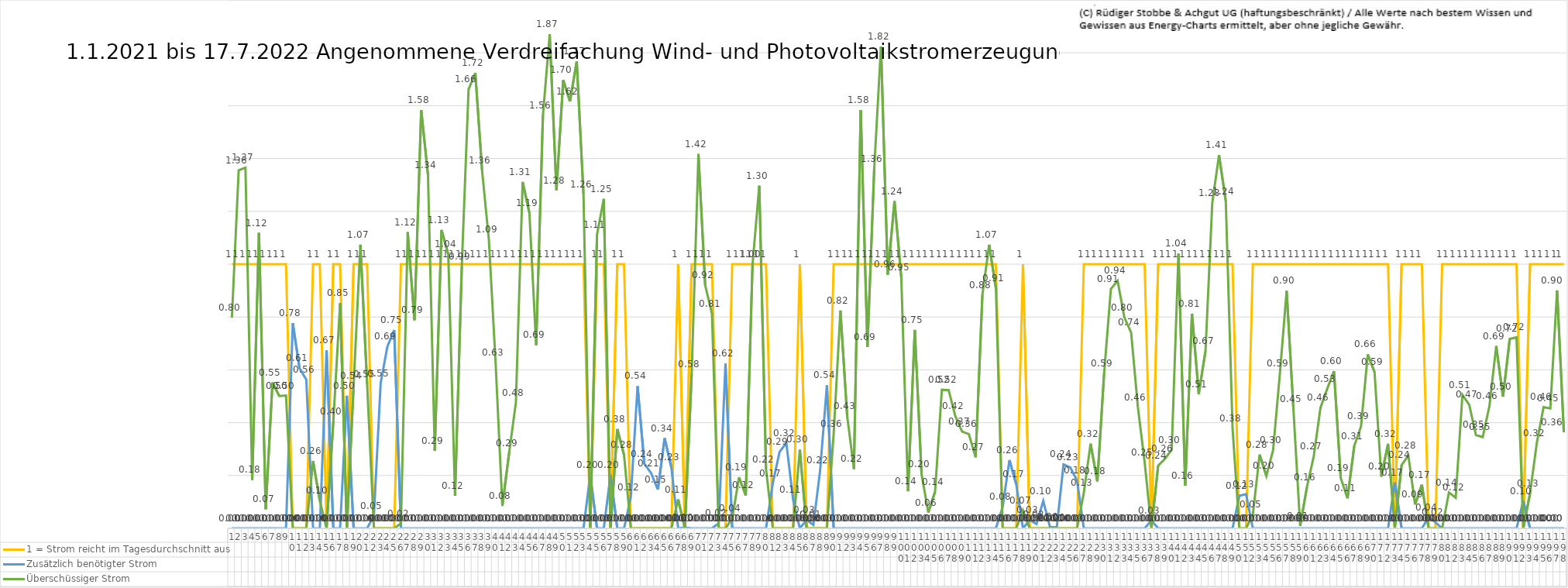
| Category | 1 = Strom reicht im Tagesdurchschnitt aus | Zusätzlich benötigter Strom | Überschüssiger Strom |
|---|---|---|---|
| 0 | 1 | 0 | 0.798 |
| 1 | 1 | 0 | 1.356 |
| 2 | 1 | 0 | 1.366 |
| 3 | 1 | 0 | 0.184 |
| 4 | 1 | 0 | 1.118 |
| 5 | 1 | 0 | 0.073 |
| 6 | 1 | 0 | 0.553 |
| 7 | 1 | 0 | 0.501 |
| 8 | 1 | 0 | 0.503 |
| 9 | 0 | 0.777 | 0 |
| 10 | 0 | 0.606 | 0 |
| 11 | 0 | 0.563 | 0 |
| 12 | 1 | 0 | 0.255 |
| 13 | 1 | 0 | 0.104 |
| 14 | 0 | 0.673 | 0 |
| 15 | 1 | 0 | 0.405 |
| 16 | 1 | 0 | 0.852 |
| 17 | 0 | 0.502 | 0 |
| 18 | 1 | 0 | 0.54 |
| 19 | 1 | 0 | 1.074 |
| 20 | 1 | 0 | 0.546 |
| 21 | 0 | 0.048 | 0 |
| 22 | 0 | 0.55 | 0 |
| 23 | 0 | 0.688 | 0 |
| 24 | 0 | 0.751 | 0 |
| 25 | 1 | 0 | 0.018 |
| 26 | 1 | 0 | 1.121 |
| 27 | 1 | 0 | 0.788 |
| 28 | 1 | 0 | 1.583 |
| 29 | 1 | 0 | 1.338 |
| 30 | 1 | 0 | 0.293 |
| 31 | 1 | 0 | 1.13 |
| 32 | 1 | 0 | 1.037 |
| 33 | 1 | 0 | 0.123 |
| 34 | 1 | 0 | 0.992 |
| 35 | 1 | 0 | 1.662 |
| 36 | 1 | 0 | 1.724 |
| 37 | 1 | 0 | 1.355 |
| 38 | 1 | 0 | 1.094 |
| 39 | 1 | 0 | 0.628 |
| 40 | 1 | 0 | 0.085 |
| 41 | 1 | 0 | 0.286 |
| 42 | 1 | 0 | 0.476 |
| 43 | 1 | 0 | 1.311 |
| 44 | 1 | 0 | 1.194 |
| 45 | 1 | 0 | 0.694 |
| 46 | 1 | 0 | 1.563 |
| 47 | 1 | 0 | 1.87 |
| 48 | 1 | 0 | 1.28 |
| 49 | 1 | 0 | 1.697 |
| 50 | 1 | 0 | 1.616 |
| 51 | 1 | 0 | 1.767 |
| 52 | 1 | 0 | 1.264 |
| 53 | 0 | 0.202 | 0 |
| 54 | 1 | 0 | 1.112 |
| 55 | 1 | 0 | 1.247 |
| 56 | 0 | 0.202 | 0 |
| 57 | 1 | 0 | 0.376 |
| 58 | 1 | 0 | 0.278 |
| 59 | 0 | 0.118 | 0 |
| 60 | 0 | 0.538 | 0 |
| 61 | 0 | 0.244 | 0 |
| 62 | 0 | 0.209 | 0 |
| 63 | 0 | 0.147 | 0 |
| 64 | 0 | 0.341 | 0 |
| 65 | 0 | 0.231 | 0 |
| 66 | 1 | 0 | 0.11 |
| 67 | 0 | 0.003 | 0 |
| 68 | 1 | 0 | 0.584 |
| 69 | 1 | 0 | 1.417 |
| 70 | 1 | 0 | 0.92 |
| 71 | 1 | 0 | 0.813 |
| 72 | 0 | 0.019 | 0 |
| 73 | 0 | 0.624 | 0 |
| 74 | 1 | 0 | 0.038 |
| 75 | 1 | 0 | 0.193 |
| 76 | 1 | 0 | 0.125 |
| 77 | 1 | 0 | 0.999 |
| 78 | 1 | 0 | 1.297 |
| 79 | 1 | 0 | 0.224 |
| 80 | 0 | 0.171 | 0 |
| 81 | 0 | 0.289 | 0 |
| 82 | 0 | 0.323 | 0 |
| 83 | 0 | 0.11 | 0 |
| 84 | 1 | 0 | 0.298 |
| 85 | 0 | 0.032 | 0 |
| 86 | 0 | 0.013 | 0 |
| 87 | 0 | 0.22 | 0 |
| 88 | 0 | 0.541 | 0 |
| 89 | 1 | 0 | 0.357 |
| 90 | 1 | 0 | 0.825 |
| 91 | 1 | 0 | 0.425 |
| 92 | 1 | 0 | 0.225 |
| 93 | 1 | 0 | 1.583 |
| 94 | 1 | 0 | 0.686 |
| 95 | 1 | 0 | 1.361 |
| 96 | 1 | 0 | 1.824 |
| 97 | 1 | 0 | 0.96 |
| 98 | 1 | 0 | 1.239 |
| 99 | 1 | 0 | 0.951 |
| 100 | 1 | 0 | 0.14 |
| 101 | 1 | 0 | 0.751 |
| 102 | 1 | 0 | 0.205 |
| 103 | 1 | 0 | 0.06 |
| 104 | 1 | 0 | 0.138 |
| 105 | 1 | 0 | 0.525 |
| 106 | 1 | 0 | 0.524 |
| 107 | 1 | 0 | 0.425 |
| 108 | 1 | 0 | 0.366 |
| 109 | 1 | 0 | 0.357 |
| 110 | 1 | 0 | 0.269 |
| 111 | 1 | 0 | 0.884 |
| 112 | 1 | 0 | 1.074 |
| 113 | 1 | 0 | 0.908 |
| 114 | 0 | 0.082 | 0 |
| 115 | 0 | 0.258 | 0 |
| 116 | 0 | 0.168 | 0 |
| 117 | 1 | 0 | 0.068 |
| 118 | 0 | 0.031 | 0 |
| 119 | 0 | 0.016 | 0 |
| 120 | 0 | 0.104 | 0 |
| 121 | 0 | 0.005 | 0 |
| 122 | 0 | 0.003 | 0 |
| 123 | 0 | 0.242 | 0 |
| 124 | 0 | 0.23 | 0 |
| 125 | 0 | 0.181 | 0 |
| 126 | 1 | 0 | 0.134 |
| 127 | 1 | 0 | 0.321 |
| 128 | 1 | 0 | 0.178 |
| 129 | 1 | 0 | 0.585 |
| 130 | 1 | 0 | 0.906 |
| 131 | 1 | 0 | 0.937 |
| 132 | 1 | 0 | 0.798 |
| 133 | 1 | 0 | 0.741 |
| 134 | 1 | 0 | 0.458 |
| 135 | 1 | 0 | 0.25 |
| 136 | 0 | 0.03 | 0 |
| 137 | 1 | 0 | 0.238 |
| 138 | 1 | 0 | 0.263 |
| 139 | 1 | 0 | 0.298 |
| 140 | 1 | 0 | 1.04 |
| 141 | 1 | 0 | 0.161 |
| 142 | 1 | 0 | 0.812 |
| 143 | 1 | 0 | 0.509 |
| 144 | 1 | 0 | 0.672 |
| 145 | 1 | 0 | 1.232 |
| 146 | 1 | 0 | 1.413 |
| 147 | 1 | 0 | 1.238 |
| 148 | 1 | 0 | 0.379 |
| 149 | 0 | 0.123 | 0 |
| 150 | 0 | 0.129 | 0 |
| 151 | 1 | 0 | 0.052 |
| 152 | 1 | 0 | 0.279 |
| 153 | 1 | 0 | 0.199 |
| 154 | 1 | 0 | 0.296 |
| 155 | 1 | 0 | 0.585 |
| 156 | 1 | 0 | 0.899 |
| 157 | 1 | 0 | 0.452 |
| 158 | 1 | 0 | 0.009 |
| 159 | 1 | 0 | 0.156 |
| 160 | 1 | 0 | 0.272 |
| 161 | 1 | 0 | 0.456 |
| 162 | 1 | 0 | 0.528 |
| 163 | 1 | 0 | 0.595 |
| 164 | 1 | 0 | 0.191 |
| 165 | 1 | 0 | 0.114 |
| 166 | 1 | 0 | 0.312 |
| 167 | 1 | 0 | 0.386 |
| 168 | 1 | 0 | 0.659 |
| 169 | 1 | 0 | 0.592 |
| 170 | 1 | 0 | 0.196 |
| 171 | 1 | 0 | 0.32 |
| 172 | 0 | 0.174 | 0 |
| 173 | 1 | 0 | 0.24 |
| 174 | 1 | 0 | 0.276 |
| 175 | 1 | 0 | 0.09 |
| 176 | 1 | 0 | 0.165 |
| 177 | 0 | 0.041 | 0 |
| 178 | 0 | 0.023 | 0 |
| 179 | 1 | 0 | 0 |
| 180 | 1 | 0 | 0.136 |
| 181 | 1 | 0 | 0.116 |
| 182 | 1 | 0 | 0.505 |
| 183 | 1 | 0 | 0.468 |
| 184 | 1 | 0 | 0.354 |
| 185 | 1 | 0 | 0.345 |
| 186 | 1 | 0 | 0.464 |
| 187 | 1 | 0 | 0.69 |
| 188 | 1 | 0 | 0.498 |
| 189 | 1 | 0 | 0.717 |
| 190 | 1 | 0 | 0.723 |
| 191 | 0 | 0.104 | 0 |
| 192 | 1 | 0 | 0.132 |
| 193 | 1 | 0 | 0.323 |
| 194 | 1 | 0 | 0.459 |
| 195 | 1 | 0 | 0.454 |
| 196 | 1 | 0 | 0.901 |
| 197 | 1 | 0 | 0.364 |